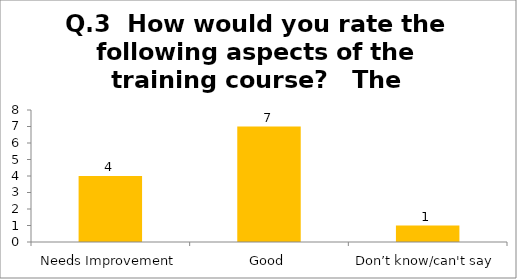
| Category | Q.3  How would you rate the following aspects of the training course?   the equipment |
|---|---|
| Needs Improvement | 4 |
| Good | 7 |
| Don’t know/can't say | 1 |